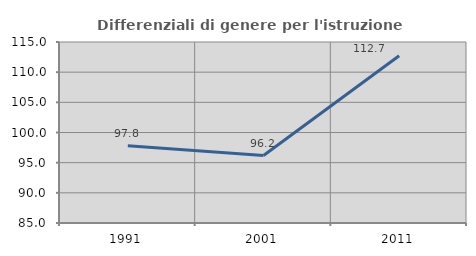
| Category | Differenziali di genere per l'istruzione superiore |
|---|---|
| 1991.0 | 97.791 |
| 2001.0 | 96.18 |
| 2011.0 | 112.709 |